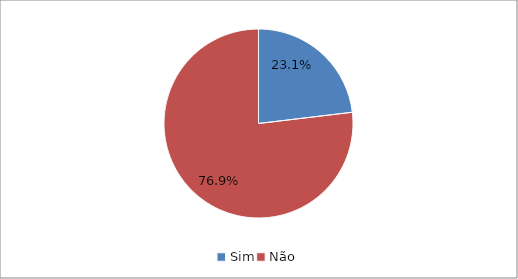
| Category | Series 0 |
|---|---|
| Sim | 0.231 |
| Não | 0.769 |